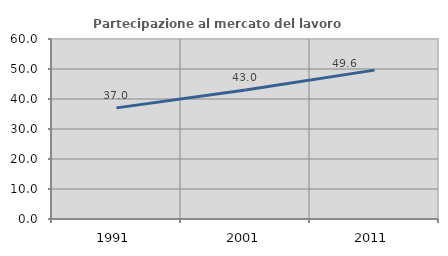
| Category | Partecipazione al mercato del lavoro  femminile |
|---|---|
| 1991.0 | 37.038 |
| 2001.0 | 42.974 |
| 2011.0 | 49.62 |